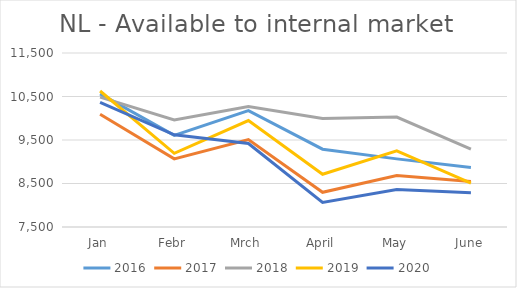
| Category | 2016 | 2017 | 2018 | 2019 | 2020 |
|---|---|---|---|---|---|
| Jan | 10559 | 10094 | 10485 | 10626.933 | 10362.095 |
| Febr | 9607 | 9066 | 9959 | 9193.272 | 9620.498 |
| Mrch | 10176 | 9508 | 10272 | 9946.418 | 9419.767 |
| April | 9289 | 8297 | 9993 | 8711.929 | 8063.729 |
| May | 9066 | 8685 | 10026 | 9249.47 | 8362.928 |
| June | 8866 | 8547 | 9288 | 8506.263 | 8289.037 |